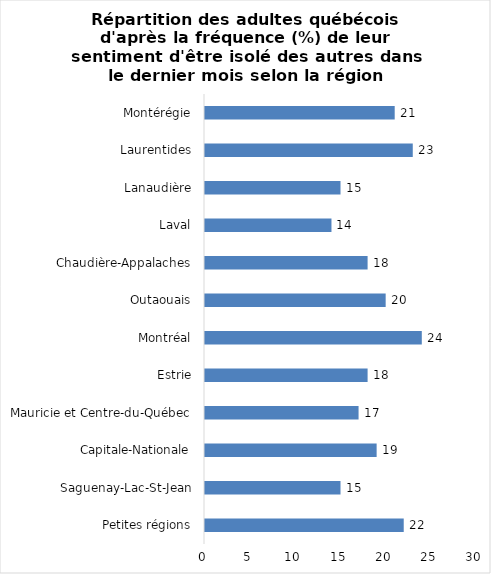
| Category | Series 0 |
|---|---|
| Petites régions | 22 |
| Saguenay-Lac-St-Jean | 15 |
| Capitale-Nationale | 19 |
| Mauricie et Centre-du-Québec | 17 |
| Estrie | 18 |
| Montréal | 24 |
| Outaouais | 20 |
| Chaudière-Appalaches | 18 |
| Laval | 14 |
| Lanaudière | 15 |
| Laurentides | 23 |
| Montérégie | 21 |